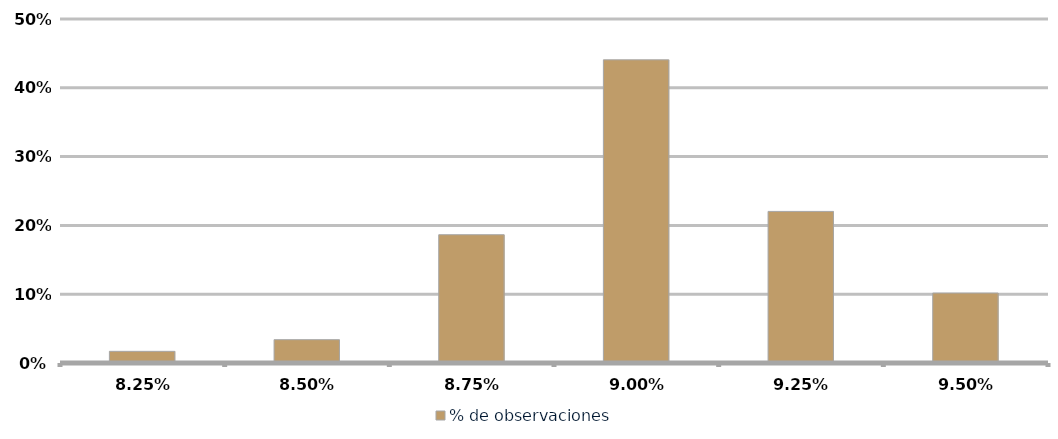
| Category | % de observaciones  |
|---|---|
| 0.08249999999999999 | 0.017 |
| 0.08499999999999999 | 0.034 |
| 0.0875 | 0.186 |
| 0.09 | 0.441 |
| 0.0925 | 0.22 |
| 0.095 | 0.102 |